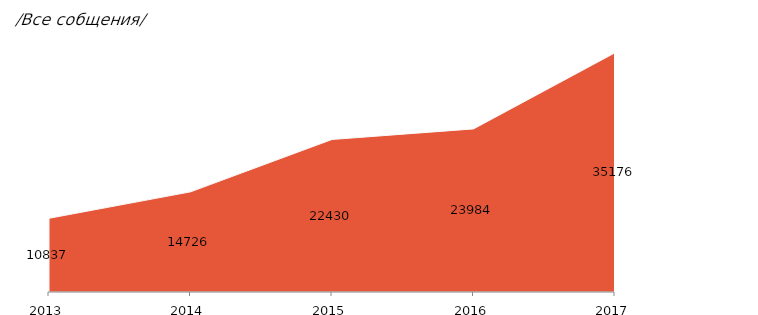
| Category | Все собщения |
|---|---|
| 2013 | 10837 |
| 2014 | 14726 |
| 2015 | 22430 |
| 2016 | 23984 |
| 2017 | 35176 |